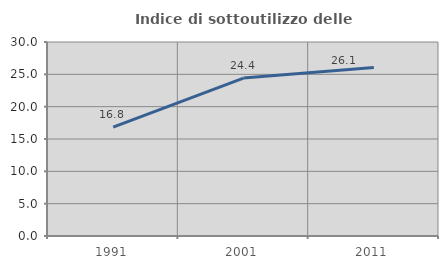
| Category | Indice di sottoutilizzo delle abitazioni  |
|---|---|
| 1991.0 | 16.845 |
| 2001.0 | 24.427 |
| 2011.0 | 26.068 |